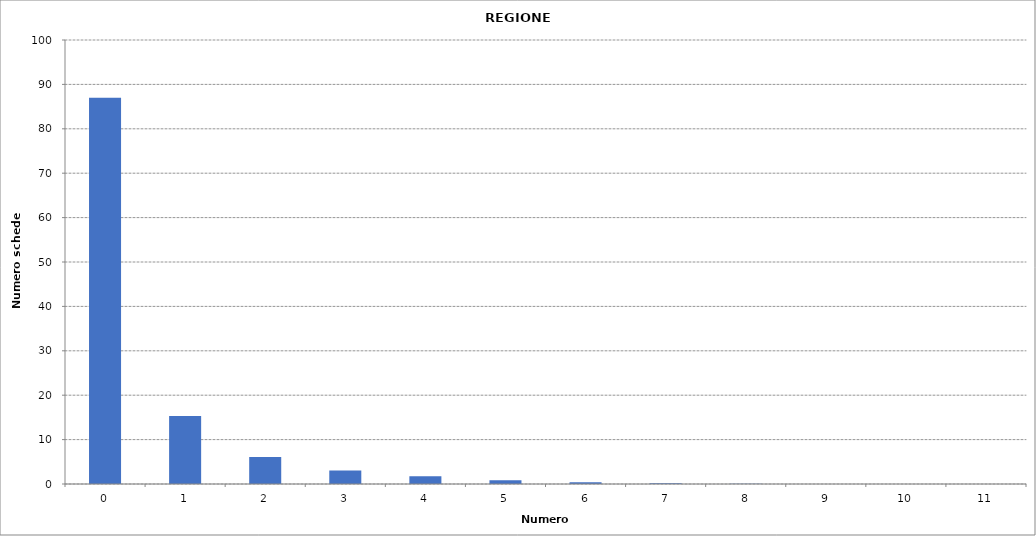
| Category | Series 0 |
|---|---|
| 0.0 | 87012 |
| 1.0 | 15295 |
| 2.0 | 6058 |
| 3.0 | 3045 |
| 4.0 | 1766 |
| 5.0 | 831 |
| 6.0 | 414 |
| 7.0 | 168 |
| 8.0 | 51 |
| 9.0 | 18 |
| 10.0 | 7 |
| 11.0 | 3 |